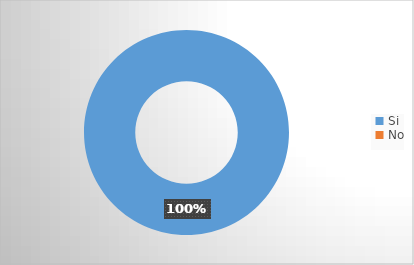
| Category | Series 0 |
|---|---|
| Si | 1 |
| No | 0 |